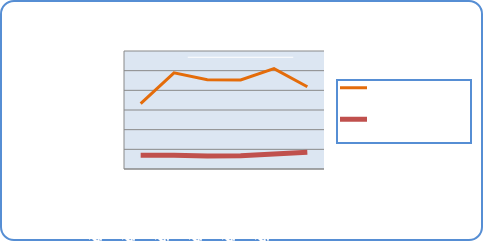
| Category | Motorin Türleri  | Benzin Türleri |
|---|---|---|
| 1/1/18 | 33231008.46 | 6994988.159 |
| 1/2/18 | 48879382.95 | 6957130.343 |
| 1/3/18 | 45420303.068 | 6644727.103 |
| 1/4/18 | 45300188.245 | 6757167.022 |
| 1/5/18 | 51040265.204 | 7683237.452 |
| 1/6/18 | 41850290.561 | 8522307.175 |